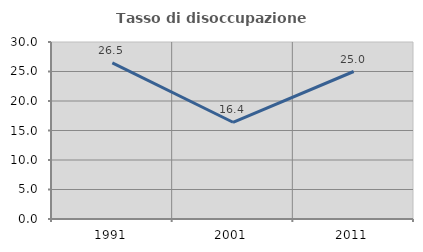
| Category | Tasso di disoccupazione giovanile  |
|---|---|
| 1991.0 | 26.471 |
| 2001.0 | 16.393 |
| 2011.0 | 25 |